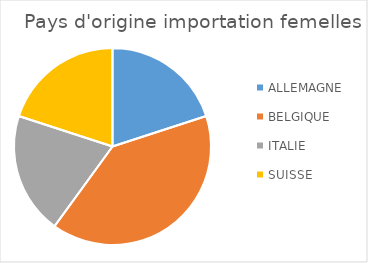
| Category | Series 0 |
|---|---|
| ALLEMAGNE | 1 |
| BELGIQUE | 2 |
| ITALIE | 1 |
| SUISSE | 1 |